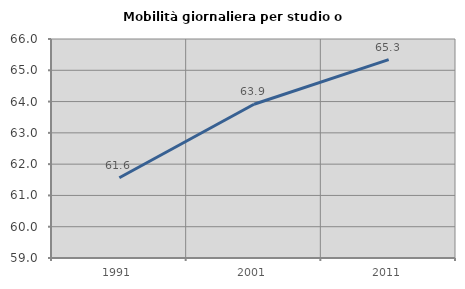
| Category | Mobilità giornaliera per studio o lavoro |
|---|---|
| 1991.0 | 61.565 |
| 2001.0 | 63.915 |
| 2011.0 | 65.338 |